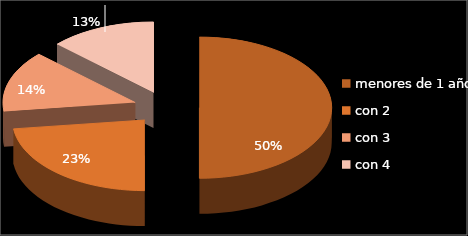
| Category | Series 0 |
|---|---|
| menores de 1 año | 0.5 |
| con 2 | 0.23 |
| con 3 | 0.14 |
| con 4 | 0.13 |